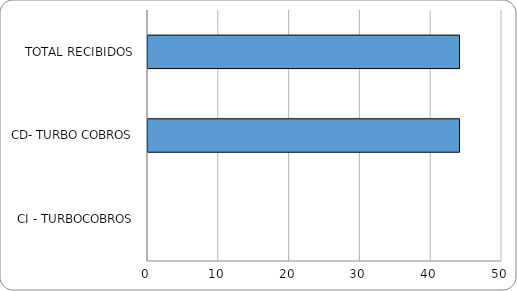
| Category | Series 0 |
|---|---|
| TOTAL RECIBIDOS | 44 |
| CD- TURBO COBROS | 44 |
| CI - TURBOCOBROS | 0 |